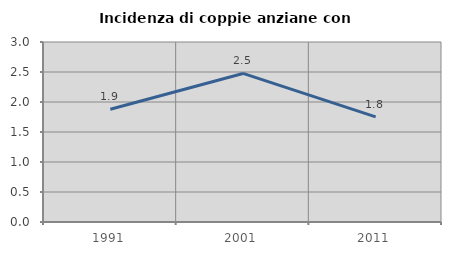
| Category | Incidenza di coppie anziane con figli |
|---|---|
| 1991.0 | 1.88 |
| 2001.0 | 2.476 |
| 2011.0 | 1.751 |